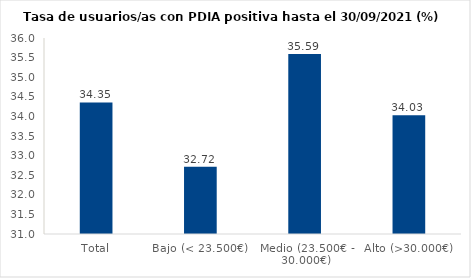
| Category | Series 0 |
|---|---|
| Total | 34.355 |
| Bajo (< 23.500€) | 32.716 |
| Medio (23.500€ - 30.000€) | 35.591 |
| Alto (>30.000€) | 34.027 |